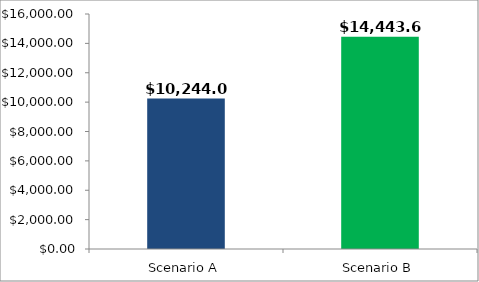
| Category | Annual Income in Retirement (Today's Dollars): |
|---|---|
| Scenario A | 10244.001 |
| Scenario B | 14443.637 |